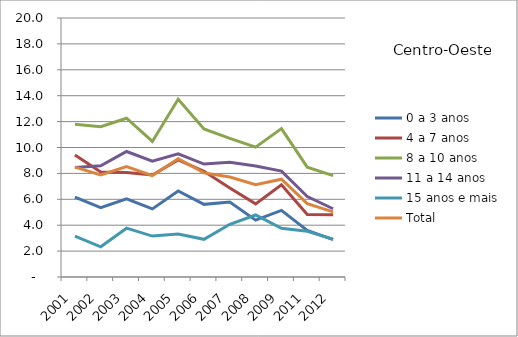
| Category | 0 a 3 anos | 4 a 7 anos | 8 a 10 anos | 11 a 14 anos | 15 anos e mais | Total |
|---|---|---|---|---|---|---|
| 2001.0 | 6.16 | 9.42 | 11.79 | 8.45 | 3.16 | 8.48 |
| 2002.0 | 5.35 | 8.11 | 11.6 | 8.59 | 2.33 | 7.89 |
| 2003.0 | 6.04 | 8.07 | 12.26 | 9.69 | 3.77 | 8.52 |
| 2004.0 | 5.26 | 7.87 | 10.47 | 8.94 | 3.16 | 7.83 |
| 2005.0 | 6.64 | 9.04 | 13.73 | 9.51 | 3.32 | 9.13 |
| 2006.0 | 5.61 | 8.16 | 11.43 | 8.72 | 2.91 | 8.04 |
| 2007.0 | 5.79 | 6.88 | 10.71 | 8.86 | 4.07 | 7.72 |
| 2008.0 | 4.39 | 5.65 | 10.03 | 8.57 | 4.79 | 7.12 |
| 2009.0 | 5.14 | 7.12 | 11.46 | 8.18 | 3.76 | 7.55 |
| 2011.0 | 3.59 | 4.82 | 8.48 | 6.21 | 3.53 | 5.66 |
| 2012.0 | 2.88 | 4.81 | 7.83 | 5.27 | 2.92 | 5.03 |